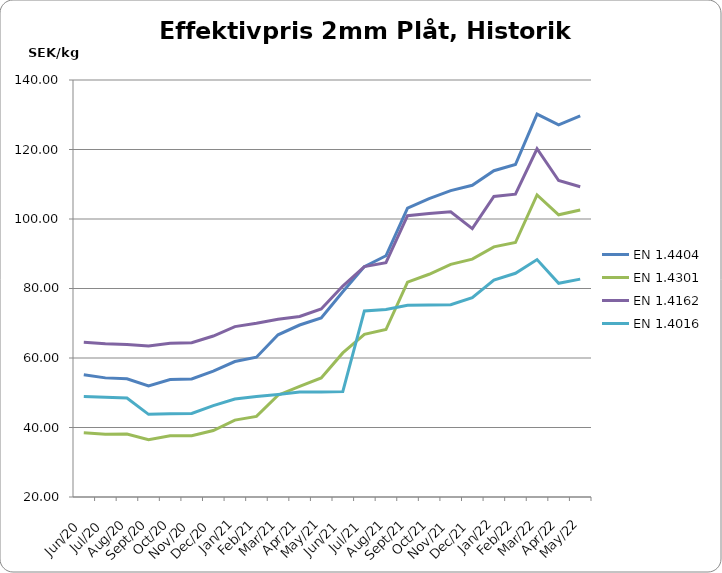
| Category | EN 1.4404 | EN 1.4301 | EN 1.4162  | EN 1.4016 |
|---|---|---|---|---|
| 2020-06-01 | 55.205 | 38.457 | 64.504 | 48.924 |
| 2020-07-01 | 54.28 | 38.09 | 64.1 | 48.67 |
| 2020-08-01 | 54.032 | 38.136 | 63.889 | 48.499 |
| 2020-09-01 | 51.982 | 36.492 | 63.459 | 43.787 |
| 2020-10-01 | 53.8 | 37.597 | 64.242 | 43.938 |
| 2020-11-01 | 53.982 | 37.627 | 64.412 | 44.061 |
| 2020-12-01 | 56.202 | 39.117 | 66.315 | 46.295 |
| 2021-01-01 | 58.983 | 42.129 | 69.024 | 48.184 |
| 2021-02-01 | 60.225 | 43.204 | 69.988 | 48.927 |
| 2021-03-01 | 66.669 | 49.29 | 71.179 | 49.506 |
| 2021-04-01 | 69.492 | 51.816 | 71.943 | 50.186 |
| 2021-05-01 | 71.536 | 54.26 | 74.099 | 50.223 |
| 2021-06-01 | 79.083 | 61.461 | 80.71 | 50.323 |
| 2021-07-01 | 86.292 | 66.826 | 86.308 | 73.542 |
| 2021-08-01 | 89.42 | 68.2 | 87.42 | 73.98 |
| 2021-09-01 | 103.148 | 81.81 | 100.943 | 75.172 |
| 2021-10-01 | 105.871 | 84.099 | 101.563 | 75.235 |
| 2021-11-01 | 108.169 | 86.954 | 102.06 | 75.332 |
| 2021-12-01 | 109.704 | 88.455 | 97.233 | 77.333 |
| 2022-01-01 | 113.9 | 91.98 | 106.49 | 82.43 |
| 2022-02-01 | 115.671 | 93.233 | 107.137 | 84.378 |
| 2022-03-01 | 130.171 | 106.93 | 120.21 | 88.325 |
| 2022-04-01 | 127.115 | 101.198 | 111.064 | 81.493 |
| 2022-05-01 | 129.692 | 102.611 | 109.291 | 82.696 |